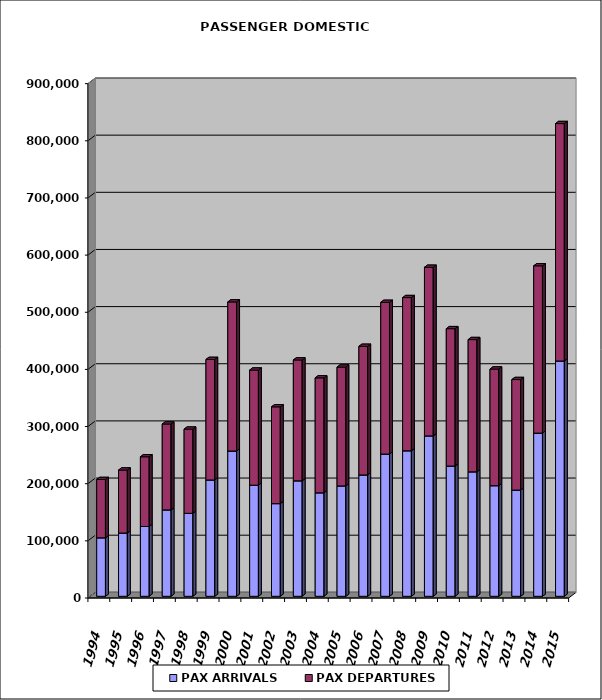
| Category | PAX ARRIVALS | PAX DEPARTURES |
|---|---|---|
| 1994.0 | 102386 | 101974 |
| 1995.0 | 110777 | 110133 |
| 1996.0 | 122136 | 122010 |
| 1997.0 | 151231 | 150240 |
| 1998.0 | 145216 | 147288 |
| 1999.0 | 203598 | 210831 |
| 2000.0 | 254231 | 260862 |
| 2001.0 | 194480 | 201384 |
| 2002.0 | 162173 | 169348 |
| 2003.0 | 202107 | 211434 |
| 2004.0 | 181122 | 201102 |
| 2005.0 | 193179 | 207962 |
| 2006.0 | 212376 | 225027 |
| 2007.0 | 248906 | 265412 |
| 2008.0 | 254659 | 267999 |
| 2009.0 | 280717 | 294970 |
| 2010.0 | 227956 | 240323 |
| 2011.0 | 217817 | 231394 |
| 2012.0 | 193565 | 204096 |
| 2013.0 | 185888 | 193392 |
| 2014.0 | 285611 | 292675 |
| 2015.0 | 411793 | 415397 |